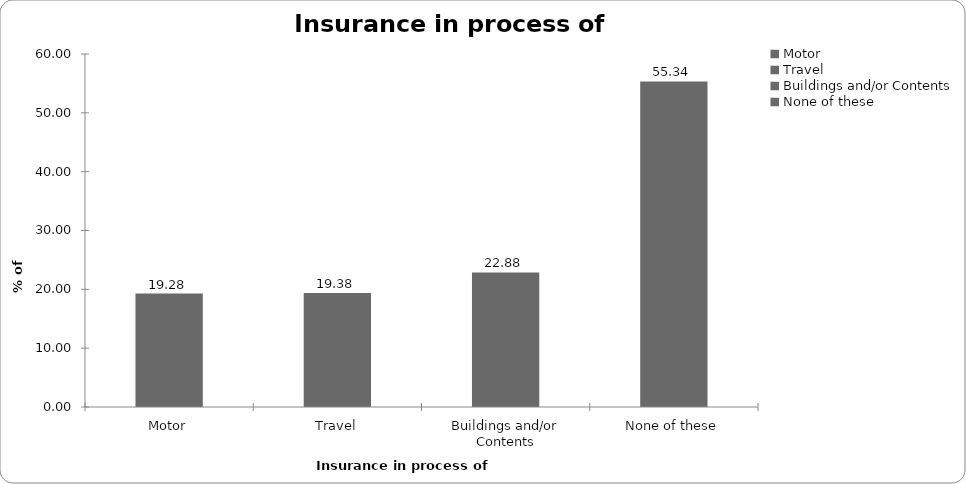
| Category | Insurance in process of buying |
|---|---|
| Motor | 19.281 |
| Travel | 19.381 |
| Buildings and/or Contents | 22.877 |
| None of these | 55.345 |